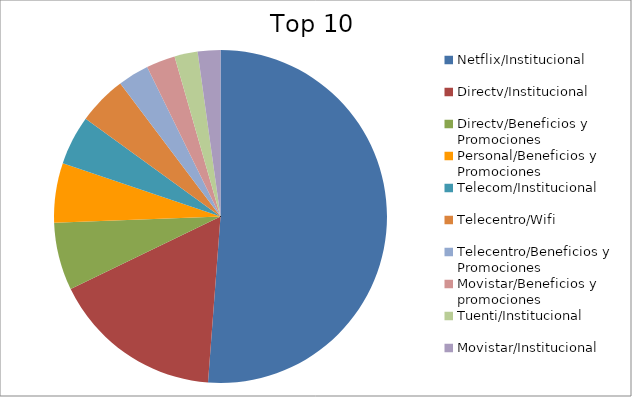
| Category | Series 0 |
|---|---|
| Netflix/Institucional | 42.8 |
| Directv/Institucional | 13.9 |
| Directv/Beneficios y Promociones | 5.5 |
| Personal/Beneficios y Promociones | 4.84 |
| Telecom/Institucional | 4 |
| Telecentro/Wifi | 3.97 |
| Telecentro/Beneficios y Promociones | 2.52 |
| Movistar/Beneficios y promociones | 2.35 |
| Tuenti/Institucional | 1.88 |
| Movistar/Institucional | 1.84 |